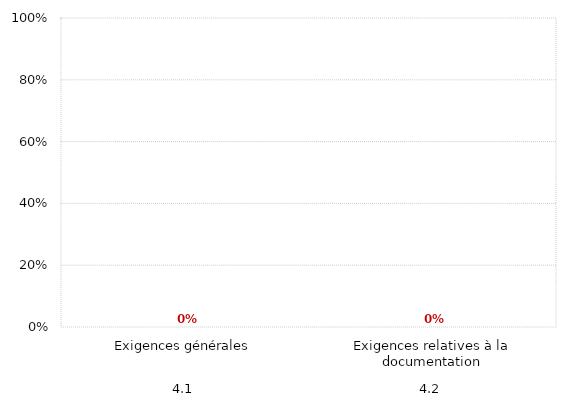
| Category | serie1 |
|---|---|
| 0 | 0 |
| 1 | 0 |